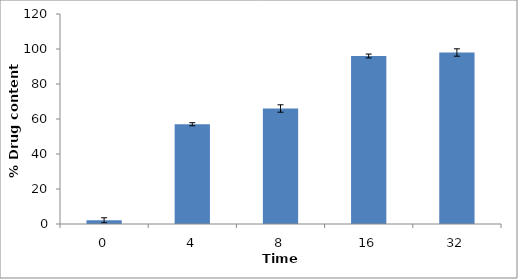
| Category | Series 0 |
|---|---|
| 0.0 | 2.11 |
| 4.0 | 57 |
| 8.0 | 66 |
| 16.0 | 96 |
| 32.0 | 98 |